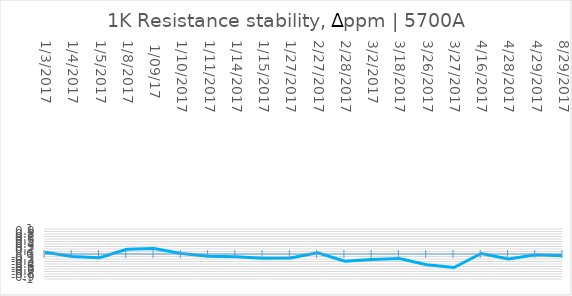
| Category | Series 0 |
|---|---|
| 1/3/2017 | 0.07 |
| 1/4/2017 | -0.1 |
| 1/5/2017 | -0.15 |
| 1/8/2017 | 0.19 |
|  1/09/17 | 0.22 |
| 1/10/2017 | 0.02 |
| 1/11/2017 | -0.09 |
| 1/14/2017 | -0.11 |
| 1/15/2017 | -0.17 |
| 1/27/2017 | -0.16 |
| 2/27/2017 | 0.05 |
| 2/28/2017 | -0.29 |
| 3/2/2017 | -0.22 |
| 3/18/2017 | -0.18 |
| 3/26/2017 | -0.43 |
| 3/27/2017 | -0.54 |
| 4/16/2017 | 0.02 |
| 4/28/2017 | -0.2 |
| 4/29/2017 | -0.03 |
| 8/29/2017 | -0.07 |